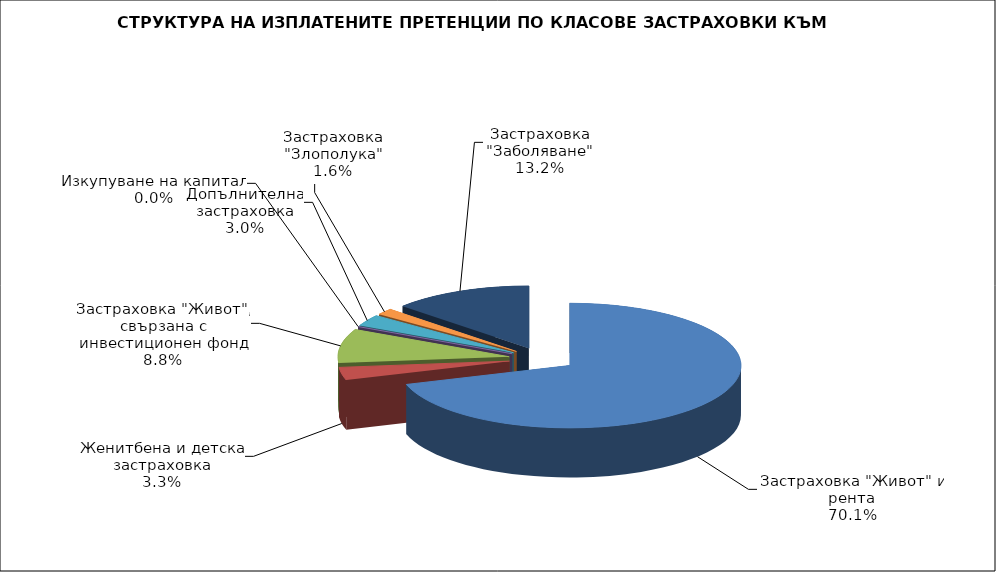
| Category | 97 767 193 |
|---|---|
| Застраховка "Живот" и рента | 97767193.232 |
| Женитбена и детска застраховка | 4606248.157 |
| Застраховка "Живот", свързана с инвестиционен фонд | 12285371.312 |
| Изкупуване на капитал | 0 |
| Допълнителна застраховка | 4150254.407 |
| Застраховка "Злополука" | 2291641.321 |
| Застраховка "Заболяване" | 18390006.839 |